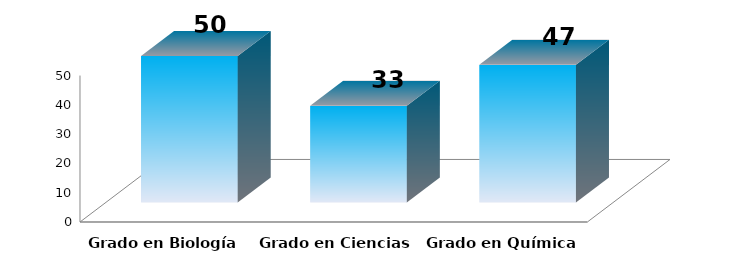
| Category | Series 0 |
|---|---|
| Grado en Biología | 50 |
| Grado en Ciencias Ambientales | 33 |
| Grado en Química | 47 |